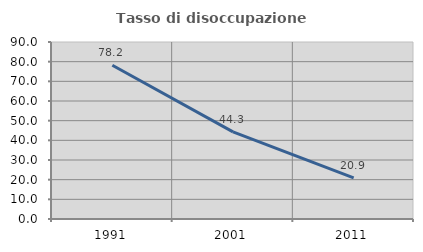
| Category | Tasso di disoccupazione giovanile  |
|---|---|
| 1991.0 | 78.182 |
| 2001.0 | 44.286 |
| 2011.0 | 20.93 |